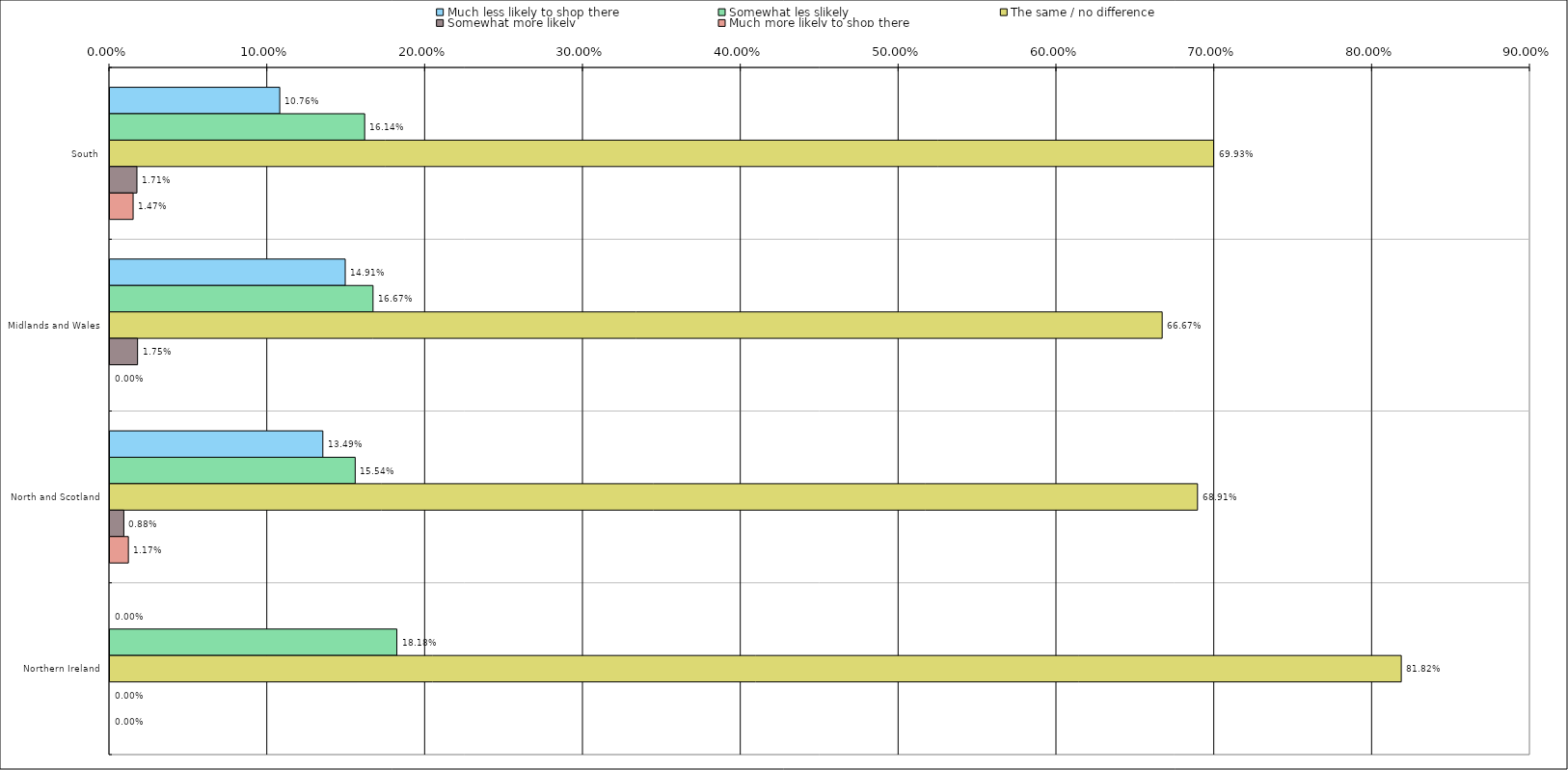
| Category | Much less likely to shop there | Somewhat les slikely | The same / no difference | Somewhat more likely | Much more likely to shop there |
|---|---|---|---|---|---|
| 0 | 0.108 | 0.161 | 0.699 | 0.017 | 0.015 |
| 1 | 0.149 | 0.167 | 0.667 | 0.018 | 0 |
| 2 | 0.135 | 0.155 | 0.689 | 0.009 | 0.012 |
| 3 | 0 | 0.182 | 0.818 | 0 | 0 |